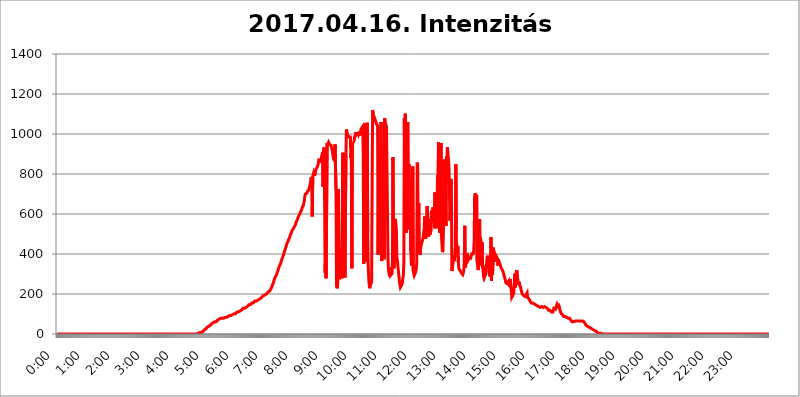
| Category | 2017.04.16. Intenzitás [W/m^2] |
|---|---|
| 0.0 | 0 |
| 0.0006944444444444445 | 0 |
| 0.001388888888888889 | 0 |
| 0.0020833333333333333 | 0 |
| 0.002777777777777778 | 0 |
| 0.003472222222222222 | 0 |
| 0.004166666666666667 | 0 |
| 0.004861111111111111 | 0 |
| 0.005555555555555556 | 0 |
| 0.0062499999999999995 | 0 |
| 0.006944444444444444 | 0 |
| 0.007638888888888889 | 0 |
| 0.008333333333333333 | 0 |
| 0.009027777777777779 | 0 |
| 0.009722222222222222 | 0 |
| 0.010416666666666666 | 0 |
| 0.011111111111111112 | 0 |
| 0.011805555555555555 | 0 |
| 0.012499999999999999 | 0 |
| 0.013194444444444444 | 0 |
| 0.013888888888888888 | 0 |
| 0.014583333333333332 | 0 |
| 0.015277777777777777 | 0 |
| 0.015972222222222224 | 0 |
| 0.016666666666666666 | 0 |
| 0.017361111111111112 | 0 |
| 0.018055555555555557 | 0 |
| 0.01875 | 0 |
| 0.019444444444444445 | 0 |
| 0.02013888888888889 | 0 |
| 0.020833333333333332 | 0 |
| 0.02152777777777778 | 0 |
| 0.022222222222222223 | 0 |
| 0.02291666666666667 | 0 |
| 0.02361111111111111 | 0 |
| 0.024305555555555556 | 0 |
| 0.024999999999999998 | 0 |
| 0.025694444444444447 | 0 |
| 0.02638888888888889 | 0 |
| 0.027083333333333334 | 0 |
| 0.027777777777777776 | 0 |
| 0.02847222222222222 | 0 |
| 0.029166666666666664 | 0 |
| 0.029861111111111113 | 0 |
| 0.030555555555555555 | 0 |
| 0.03125 | 0 |
| 0.03194444444444445 | 0 |
| 0.03263888888888889 | 0 |
| 0.03333333333333333 | 0 |
| 0.034027777777777775 | 0 |
| 0.034722222222222224 | 0 |
| 0.035416666666666666 | 0 |
| 0.036111111111111115 | 0 |
| 0.03680555555555556 | 0 |
| 0.0375 | 0 |
| 0.03819444444444444 | 0 |
| 0.03888888888888889 | 0 |
| 0.03958333333333333 | 0 |
| 0.04027777777777778 | 0 |
| 0.04097222222222222 | 0 |
| 0.041666666666666664 | 0 |
| 0.042361111111111106 | 0 |
| 0.04305555555555556 | 0 |
| 0.043750000000000004 | 0 |
| 0.044444444444444446 | 0 |
| 0.04513888888888889 | 0 |
| 0.04583333333333334 | 0 |
| 0.04652777777777778 | 0 |
| 0.04722222222222222 | 0 |
| 0.04791666666666666 | 0 |
| 0.04861111111111111 | 0 |
| 0.049305555555555554 | 0 |
| 0.049999999999999996 | 0 |
| 0.05069444444444445 | 0 |
| 0.051388888888888894 | 0 |
| 0.052083333333333336 | 0 |
| 0.05277777777777778 | 0 |
| 0.05347222222222222 | 0 |
| 0.05416666666666667 | 0 |
| 0.05486111111111111 | 0 |
| 0.05555555555555555 | 0 |
| 0.05625 | 0 |
| 0.05694444444444444 | 0 |
| 0.057638888888888885 | 0 |
| 0.05833333333333333 | 0 |
| 0.05902777777777778 | 0 |
| 0.059722222222222225 | 0 |
| 0.06041666666666667 | 0 |
| 0.061111111111111116 | 0 |
| 0.06180555555555556 | 0 |
| 0.0625 | 0 |
| 0.06319444444444444 | 0 |
| 0.06388888888888888 | 0 |
| 0.06458333333333334 | 0 |
| 0.06527777777777778 | 0 |
| 0.06597222222222222 | 0 |
| 0.06666666666666667 | 0 |
| 0.06736111111111111 | 0 |
| 0.06805555555555555 | 0 |
| 0.06874999999999999 | 0 |
| 0.06944444444444443 | 0 |
| 0.07013888888888889 | 0 |
| 0.07083333333333333 | 0 |
| 0.07152777777777779 | 0 |
| 0.07222222222222223 | 0 |
| 0.07291666666666667 | 0 |
| 0.07361111111111111 | 0 |
| 0.07430555555555556 | 0 |
| 0.075 | 0 |
| 0.07569444444444444 | 0 |
| 0.0763888888888889 | 0 |
| 0.07708333333333334 | 0 |
| 0.07777777777777778 | 0 |
| 0.07847222222222222 | 0 |
| 0.07916666666666666 | 0 |
| 0.0798611111111111 | 0 |
| 0.08055555555555556 | 0 |
| 0.08125 | 0 |
| 0.08194444444444444 | 0 |
| 0.08263888888888889 | 0 |
| 0.08333333333333333 | 0 |
| 0.08402777777777777 | 0 |
| 0.08472222222222221 | 0 |
| 0.08541666666666665 | 0 |
| 0.08611111111111112 | 0 |
| 0.08680555555555557 | 0 |
| 0.08750000000000001 | 0 |
| 0.08819444444444445 | 0 |
| 0.08888888888888889 | 0 |
| 0.08958333333333333 | 0 |
| 0.09027777777777778 | 0 |
| 0.09097222222222222 | 0 |
| 0.09166666666666667 | 0 |
| 0.09236111111111112 | 0 |
| 0.09305555555555556 | 0 |
| 0.09375 | 0 |
| 0.09444444444444444 | 0 |
| 0.09513888888888888 | 0 |
| 0.09583333333333333 | 0 |
| 0.09652777777777777 | 0 |
| 0.09722222222222222 | 0 |
| 0.09791666666666667 | 0 |
| 0.09861111111111111 | 0 |
| 0.09930555555555555 | 0 |
| 0.09999999999999999 | 0 |
| 0.10069444444444443 | 0 |
| 0.1013888888888889 | 0 |
| 0.10208333333333335 | 0 |
| 0.10277777777777779 | 0 |
| 0.10347222222222223 | 0 |
| 0.10416666666666667 | 0 |
| 0.10486111111111111 | 0 |
| 0.10555555555555556 | 0 |
| 0.10625 | 0 |
| 0.10694444444444444 | 0 |
| 0.1076388888888889 | 0 |
| 0.10833333333333334 | 0 |
| 0.10902777777777778 | 0 |
| 0.10972222222222222 | 0 |
| 0.1111111111111111 | 0 |
| 0.11180555555555556 | 0 |
| 0.11180555555555556 | 0 |
| 0.1125 | 0 |
| 0.11319444444444444 | 0 |
| 0.11388888888888889 | 0 |
| 0.11458333333333333 | 0 |
| 0.11527777777777777 | 0 |
| 0.11597222222222221 | 0 |
| 0.11666666666666665 | 0 |
| 0.1173611111111111 | 0 |
| 0.11805555555555557 | 0 |
| 0.11944444444444445 | 0 |
| 0.12013888888888889 | 0 |
| 0.12083333333333333 | 0 |
| 0.12152777777777778 | 0 |
| 0.12222222222222223 | 0 |
| 0.12291666666666667 | 0 |
| 0.12291666666666667 | 0 |
| 0.12361111111111112 | 0 |
| 0.12430555555555556 | 0 |
| 0.125 | 0 |
| 0.12569444444444444 | 0 |
| 0.12638888888888888 | 0 |
| 0.12708333333333333 | 0 |
| 0.16875 | 0 |
| 0.12847222222222224 | 0 |
| 0.12916666666666668 | 0 |
| 0.12986111111111112 | 0 |
| 0.13055555555555556 | 0 |
| 0.13125 | 0 |
| 0.13194444444444445 | 0 |
| 0.1326388888888889 | 0 |
| 0.13333333333333333 | 0 |
| 0.13402777777777777 | 0 |
| 0.13402777777777777 | 0 |
| 0.13472222222222222 | 0 |
| 0.13541666666666666 | 0 |
| 0.1361111111111111 | 0 |
| 0.13749999999999998 | 0 |
| 0.13819444444444443 | 0 |
| 0.1388888888888889 | 0 |
| 0.13958333333333334 | 0 |
| 0.14027777777777778 | 0 |
| 0.14097222222222222 | 0 |
| 0.14166666666666666 | 0 |
| 0.1423611111111111 | 0 |
| 0.14305555555555557 | 0 |
| 0.14375000000000002 | 0 |
| 0.14444444444444446 | 0 |
| 0.1451388888888889 | 0 |
| 0.1451388888888889 | 0 |
| 0.14652777777777778 | 0 |
| 0.14722222222222223 | 0 |
| 0.14791666666666667 | 0 |
| 0.1486111111111111 | 0 |
| 0.14930555555555555 | 0 |
| 0.15 | 0 |
| 0.15069444444444444 | 0 |
| 0.15138888888888888 | 0 |
| 0.15208333333333332 | 0 |
| 0.15277777777777776 | 0 |
| 0.15347222222222223 | 0 |
| 0.15416666666666667 | 0 |
| 0.15486111111111112 | 0 |
| 0.15555555555555556 | 0 |
| 0.15625 | 0 |
| 0.15694444444444444 | 0 |
| 0.15763888888888888 | 0 |
| 0.15833333333333333 | 0 |
| 0.15902777777777777 | 0 |
| 0.15972222222222224 | 0 |
| 0.16041666666666668 | 0 |
| 0.16111111111111112 | 0 |
| 0.16180555555555556 | 0 |
| 0.1625 | 0 |
| 0.16319444444444445 | 0 |
| 0.1638888888888889 | 0 |
| 0.16458333333333333 | 0 |
| 0.16527777777777777 | 0 |
| 0.16597222222222222 | 0 |
| 0.16666666666666666 | 0 |
| 0.1673611111111111 | 0 |
| 0.16805555555555554 | 0 |
| 0.16874999999999998 | 0 |
| 0.16944444444444443 | 0 |
| 0.17013888888888887 | 0 |
| 0.1708333333333333 | 0 |
| 0.17152777777777775 | 0 |
| 0.17222222222222225 | 0 |
| 0.1729166666666667 | 0 |
| 0.17361111111111113 | 0 |
| 0.17430555555555557 | 0 |
| 0.17500000000000002 | 0 |
| 0.17569444444444446 | 0 |
| 0.1763888888888889 | 0 |
| 0.17708333333333334 | 0 |
| 0.17777777777777778 | 0 |
| 0.17847222222222223 | 0 |
| 0.17916666666666667 | 0 |
| 0.1798611111111111 | 0 |
| 0.18055555555555555 | 0 |
| 0.18125 | 0 |
| 0.18194444444444444 | 0 |
| 0.1826388888888889 | 0 |
| 0.18333333333333335 | 0 |
| 0.1840277777777778 | 0 |
| 0.18472222222222223 | 0 |
| 0.18541666666666667 | 0 |
| 0.18611111111111112 | 0 |
| 0.18680555555555556 | 0 |
| 0.1875 | 0 |
| 0.18819444444444444 | 0 |
| 0.18888888888888888 | 0 |
| 0.18958333333333333 | 0 |
| 0.19027777777777777 | 0 |
| 0.1909722222222222 | 0 |
| 0.19166666666666665 | 0 |
| 0.19236111111111112 | 0 |
| 0.19305555555555554 | 0 |
| 0.19375 | 0 |
| 0.19444444444444445 | 0 |
| 0.1951388888888889 | 3.525 |
| 0.19583333333333333 | 0 |
| 0.19652777777777777 | 3.525 |
| 0.19722222222222222 | 3.525 |
| 0.19791666666666666 | 3.525 |
| 0.1986111111111111 | 3.525 |
| 0.19930555555555554 | 3.525 |
| 0.19999999999999998 | 7.887 |
| 0.20069444444444443 | 7.887 |
| 0.20138888888888887 | 7.887 |
| 0.2020833333333333 | 7.887 |
| 0.2027777777777778 | 12.257 |
| 0.2034722222222222 | 12.257 |
| 0.2041666666666667 | 12.257 |
| 0.20486111111111113 | 12.257 |
| 0.20555555555555557 | 16.636 |
| 0.20625000000000002 | 21.024 |
| 0.20694444444444446 | 21.024 |
| 0.2076388888888889 | 25.419 |
| 0.20833333333333334 | 25.419 |
| 0.20902777777777778 | 29.823 |
| 0.20972222222222223 | 29.823 |
| 0.21041666666666667 | 34.234 |
| 0.2111111111111111 | 34.234 |
| 0.21180555555555555 | 38.653 |
| 0.2125 | 38.653 |
| 0.21319444444444444 | 38.653 |
| 0.2138888888888889 | 43.079 |
| 0.21458333333333335 | 43.079 |
| 0.2152777777777778 | 47.511 |
| 0.21597222222222223 | 47.511 |
| 0.21666666666666667 | 51.951 |
| 0.21736111111111112 | 51.951 |
| 0.21805555555555556 | 56.398 |
| 0.21875 | 56.398 |
| 0.21944444444444444 | 56.398 |
| 0.22013888888888888 | 60.85 |
| 0.22083333333333333 | 60.85 |
| 0.22152777777777777 | 60.85 |
| 0.2222222222222222 | 60.85 |
| 0.22291666666666665 | 60.85 |
| 0.2236111111111111 | 65.31 |
| 0.22430555555555556 | 65.31 |
| 0.225 | 69.775 |
| 0.22569444444444445 | 69.775 |
| 0.2263888888888889 | 74.246 |
| 0.22708333333333333 | 74.246 |
| 0.22777777777777777 | 74.246 |
| 0.22847222222222222 | 78.722 |
| 0.22916666666666666 | 78.722 |
| 0.2298611111111111 | 78.722 |
| 0.23055555555555554 | 78.722 |
| 0.23124999999999998 | 78.722 |
| 0.23194444444444443 | 78.722 |
| 0.23263888888888887 | 78.722 |
| 0.2333333333333333 | 78.722 |
| 0.2340277777777778 | 83.205 |
| 0.2347222222222222 | 83.205 |
| 0.2354166666666667 | 83.205 |
| 0.23611111111111113 | 83.205 |
| 0.23680555555555557 | 83.205 |
| 0.23750000000000002 | 83.205 |
| 0.23819444444444446 | 83.205 |
| 0.2388888888888889 | 87.692 |
| 0.23958333333333334 | 87.692 |
| 0.24027777777777778 | 87.692 |
| 0.24097222222222223 | 87.692 |
| 0.24166666666666667 | 92.184 |
| 0.2423611111111111 | 92.184 |
| 0.24305555555555555 | 92.184 |
| 0.24375 | 92.184 |
| 0.24444444444444446 | 92.184 |
| 0.24513888888888888 | 96.682 |
| 0.24583333333333335 | 96.682 |
| 0.2465277777777778 | 96.682 |
| 0.24722222222222223 | 101.184 |
| 0.24791666666666667 | 101.184 |
| 0.24861111111111112 | 101.184 |
| 0.24930555555555556 | 101.184 |
| 0.25 | 101.184 |
| 0.25069444444444444 | 105.69 |
| 0.2513888888888889 | 105.69 |
| 0.2520833333333333 | 110.201 |
| 0.25277777777777777 | 110.201 |
| 0.2534722222222222 | 110.201 |
| 0.25416666666666665 | 110.201 |
| 0.2548611111111111 | 114.716 |
| 0.2555555555555556 | 114.716 |
| 0.25625000000000003 | 114.716 |
| 0.2569444444444445 | 119.235 |
| 0.2576388888888889 | 119.235 |
| 0.25833333333333336 | 119.235 |
| 0.2590277777777778 | 123.758 |
| 0.25972222222222224 | 123.758 |
| 0.2604166666666667 | 128.284 |
| 0.2611111111111111 | 128.284 |
| 0.26180555555555557 | 128.284 |
| 0.2625 | 128.284 |
| 0.26319444444444445 | 132.814 |
| 0.2638888888888889 | 132.814 |
| 0.26458333333333334 | 132.814 |
| 0.2652777777777778 | 137.347 |
| 0.2659722222222222 | 137.347 |
| 0.26666666666666666 | 137.347 |
| 0.2673611111111111 | 141.884 |
| 0.26805555555555555 | 141.884 |
| 0.26875 | 146.423 |
| 0.26944444444444443 | 146.423 |
| 0.2701388888888889 | 146.423 |
| 0.2708333333333333 | 146.423 |
| 0.27152777777777776 | 150.964 |
| 0.2722222222222222 | 150.964 |
| 0.27291666666666664 | 155.509 |
| 0.2736111111111111 | 155.509 |
| 0.2743055555555555 | 155.509 |
| 0.27499999999999997 | 155.509 |
| 0.27569444444444446 | 160.056 |
| 0.27638888888888885 | 160.056 |
| 0.27708333333333335 | 164.605 |
| 0.2777777777777778 | 164.605 |
| 0.27847222222222223 | 164.605 |
| 0.2791666666666667 | 164.605 |
| 0.2798611111111111 | 169.156 |
| 0.28055555555555556 | 169.156 |
| 0.28125 | 169.156 |
| 0.28194444444444444 | 173.709 |
| 0.2826388888888889 | 173.709 |
| 0.2833333333333333 | 173.709 |
| 0.28402777777777777 | 178.264 |
| 0.2847222222222222 | 178.264 |
| 0.28541666666666665 | 178.264 |
| 0.28611111111111115 | 182.82 |
| 0.28680555555555554 | 182.82 |
| 0.28750000000000003 | 187.378 |
| 0.2881944444444445 | 187.378 |
| 0.2888888888888889 | 187.378 |
| 0.28958333333333336 | 191.937 |
| 0.2902777777777778 | 191.937 |
| 0.29097222222222224 | 191.937 |
| 0.2916666666666667 | 196.497 |
| 0.2923611111111111 | 196.497 |
| 0.29305555555555557 | 201.058 |
| 0.29375 | 201.058 |
| 0.29444444444444445 | 205.62 |
| 0.2951388888888889 | 205.62 |
| 0.29583333333333334 | 210.182 |
| 0.2965277777777778 | 210.182 |
| 0.2972222222222222 | 210.182 |
| 0.29791666666666666 | 214.746 |
| 0.2986111111111111 | 219.309 |
| 0.29930555555555555 | 223.873 |
| 0.3 | 228.436 |
| 0.30069444444444443 | 233 |
| 0.3013888888888889 | 237.564 |
| 0.3020833333333333 | 246.689 |
| 0.30277777777777776 | 251.251 |
| 0.3034722222222222 | 260.373 |
| 0.30416666666666664 | 269.49 |
| 0.3048611111111111 | 278.603 |
| 0.3055555555555555 | 283.156 |
| 0.30624999999999997 | 287.709 |
| 0.3069444444444444 | 292.259 |
| 0.3076388888888889 | 296.808 |
| 0.30833333333333335 | 305.898 |
| 0.3090277777777778 | 310.44 |
| 0.30972222222222223 | 319.517 |
| 0.3104166666666667 | 328.584 |
| 0.3111111111111111 | 333.113 |
| 0.31180555555555556 | 342.162 |
| 0.3125 | 346.682 |
| 0.31319444444444444 | 351.198 |
| 0.3138888888888889 | 360.221 |
| 0.3145833333333333 | 369.23 |
| 0.31527777777777777 | 373.729 |
| 0.3159722222222222 | 382.715 |
| 0.31666666666666665 | 387.202 |
| 0.31736111111111115 | 396.164 |
| 0.31805555555555554 | 405.108 |
| 0.31875000000000003 | 414.035 |
| 0.3194444444444445 | 418.492 |
| 0.3201388888888889 | 427.39 |
| 0.32083333333333336 | 436.27 |
| 0.3215277777777778 | 445.129 |
| 0.32222222222222224 | 453.968 |
| 0.3229166666666667 | 458.38 |
| 0.3236111111111111 | 462.786 |
| 0.32430555555555557 | 471.582 |
| 0.325 | 475.972 |
| 0.32569444444444445 | 480.356 |
| 0.3263888888888889 | 489.108 |
| 0.32708333333333334 | 497.836 |
| 0.3277777777777778 | 502.192 |
| 0.3284722222222222 | 506.542 |
| 0.32916666666666666 | 515.223 |
| 0.3298611111111111 | 515.223 |
| 0.33055555555555555 | 523.88 |
| 0.33125 | 528.2 |
| 0.33194444444444443 | 532.513 |
| 0.3326388888888889 | 536.82 |
| 0.3333333333333333 | 541.121 |
| 0.3340277777777778 | 545.416 |
| 0.3347222222222222 | 553.986 |
| 0.3354166666666667 | 558.261 |
| 0.3361111111111111 | 566.793 |
| 0.3368055555555556 | 571.049 |
| 0.33749999999999997 | 579.542 |
| 0.33819444444444446 | 583.779 |
| 0.33888888888888885 | 592.233 |
| 0.33958333333333335 | 596.45 |
| 0.34027777777777773 | 600.661 |
| 0.34097222222222223 | 609.062 |
| 0.3416666666666666 | 613.252 |
| 0.3423611111111111 | 617.436 |
| 0.3430555555555555 | 625.784 |
| 0.34375 | 634.105 |
| 0.3444444444444445 | 638.256 |
| 0.3451388888888889 | 642.4 |
| 0.3458333333333334 | 654.791 |
| 0.34652777777777777 | 667.123 |
| 0.34722222222222227 | 687.544 |
| 0.34791666666666665 | 699.717 |
| 0.34861111111111115 | 703.762 |
| 0.34930555555555554 | 703.762 |
| 0.35000000000000003 | 703.762 |
| 0.3506944444444444 | 711.832 |
| 0.3513888888888889 | 715.858 |
| 0.3520833333333333 | 715.858 |
| 0.3527777777777778 | 719.877 |
| 0.3534722222222222 | 731.896 |
| 0.3541666666666667 | 739.877 |
| 0.3548611111111111 | 751.803 |
| 0.35555555555555557 | 767.62 |
| 0.35625 | 783.342 |
| 0.35694444444444445 | 751.803 |
| 0.3576388888888889 | 588.009 |
| 0.35833333333333334 | 787.258 |
| 0.3590277777777778 | 787.258 |
| 0.3597222222222222 | 806.757 |
| 0.36041666666666666 | 798.974 |
| 0.3611111111111111 | 791.169 |
| 0.36180555555555555 | 806.757 |
| 0.3625 | 818.392 |
| 0.36319444444444443 | 826.123 |
| 0.3638888888888889 | 829.981 |
| 0.3645833333333333 | 833.834 |
| 0.3652777777777778 | 841.526 |
| 0.3659722222222222 | 849.199 |
| 0.3666666666666667 | 868.305 |
| 0.3673611111111111 | 872.114 |
| 0.3680555555555556 | 868.305 |
| 0.36874999999999997 | 864.493 |
| 0.36944444444444446 | 868.305 |
| 0.37013888888888885 | 879.719 |
| 0.37083333333333335 | 887.309 |
| 0.37152777777777773 | 883.516 |
| 0.37222222222222223 | 909.996 |
| 0.3729166666666666 | 735.89 |
| 0.3736111111111111 | 925.06 |
| 0.3743055555555555 | 932.576 |
| 0.375 | 667.123 |
| 0.3756944444444445 | 305.898 |
| 0.3763888888888889 | 391.685 |
| 0.3770833333333334 | 278.603 |
| 0.37777777777777777 | 283.156 |
| 0.37847222222222227 | 955.071 |
| 0.37916666666666665 | 947.58 |
| 0.37986111111111115 | 947.58 |
| 0.38055555555555554 | 958.814 |
| 0.38125000000000003 | 955.071 |
| 0.3819444444444444 | 947.58 |
| 0.3826388888888889 | 943.832 |
| 0.3833333333333333 | 943.832 |
| 0.3840277777777778 | 943.832 |
| 0.3847222222222222 | 932.576 |
| 0.3854166666666667 | 921.298 |
| 0.3861111111111111 | 921.298 |
| 0.38680555555555557 | 921.298 |
| 0.3875 | 875.918 |
| 0.38819444444444445 | 872.114 |
| 0.3888888888888889 | 864.493 |
| 0.38958333333333334 | 947.58 |
| 0.3902777777777778 | 943.832 |
| 0.3909722222222222 | 719.877 |
| 0.39166666666666666 | 242.127 |
| 0.3923611111111111 | 228.436 |
| 0.39305555555555555 | 237.564 |
| 0.39375 | 278.603 |
| 0.39444444444444443 | 723.889 |
| 0.3951388888888889 | 310.44 |
| 0.3958333333333333 | 274.047 |
| 0.3965277777777778 | 274.047 |
| 0.3972222222222222 | 287.709 |
| 0.3979166666666667 | 427.39 |
| 0.3986111111111111 | 324.052 |
| 0.3993055555555556 | 278.603 |
| 0.39999999999999997 | 283.156 |
| 0.40069444444444446 | 906.223 |
| 0.40138888888888885 | 328.584 |
| 0.40208333333333335 | 414.035 |
| 0.40277777777777773 | 558.261 |
| 0.40347222222222223 | 283.156 |
| 0.4041666666666666 | 283.156 |
| 0.4048611111111111 | 898.668 |
| 0.4055555555555555 | 1022.323 |
| 0.40625 | 1011.118 |
| 0.4069444444444445 | 999.916 |
| 0.4076388888888889 | 992.448 |
| 0.4083333333333334 | 988.714 |
| 0.40902777777777777 | 984.98 |
| 0.40972222222222227 | 981.244 |
| 0.41041666666666665 | 981.244 |
| 0.41111111111111115 | 984.98 |
| 0.41180555555555554 | 879.719 |
| 0.41250000000000003 | 902.447 |
| 0.4131944444444444 | 328.584 |
| 0.4138888888888889 | 940.082 |
| 0.4145833333333333 | 955.071 |
| 0.4152777777777778 | 955.071 |
| 0.4159722222222222 | 962.555 |
| 0.4166666666666667 | 970.034 |
| 0.4173611111111111 | 992.448 |
| 0.41805555555555557 | 984.98 |
| 0.41875 | 1007.383 |
| 0.41944444444444445 | 992.448 |
| 0.4201388888888889 | 1007.383 |
| 0.42083333333333334 | 992.448 |
| 0.4215277777777778 | 1007.383 |
| 0.4222222222222222 | 999.916 |
| 0.42291666666666666 | 1011.118 |
| 0.4236111111111111 | 1007.383 |
| 0.42430555555555555 | 992.448 |
| 0.425 | 1014.852 |
| 0.42569444444444443 | 1007.383 |
| 0.4263888888888889 | 1026.06 |
| 0.4270833333333333 | 1026.06 |
| 0.4277777777777778 | 1022.323 |
| 0.4284722222222222 | 1037.277 |
| 0.4291666666666667 | 902.447 |
| 0.4298611111111111 | 351.198 |
| 0.4305555555555556 | 1037.277 |
| 0.43124999999999997 | 1052.255 |
| 0.43194444444444446 | 1037.277 |
| 0.43263888888888885 | 1029.798 |
| 0.43333333333333335 | 360.221 |
| 0.43402777777777773 | 588.009 |
| 0.43472222222222223 | 1056.004 |
| 0.4354166666666666 | 506.542 |
| 0.4361111111111111 | 337.639 |
| 0.4368055555555555 | 283.156 |
| 0.4375 | 246.689 |
| 0.4381944444444445 | 228.436 |
| 0.4388888888888889 | 242.127 |
| 0.4395833333333334 | 237.564 |
| 0.44027777777777777 | 242.127 |
| 0.44097222222222227 | 260.373 |
| 0.44166666666666665 | 747.834 |
| 0.44236111111111115 | 1120.238 |
| 0.44305555555555554 | 1101.226 |
| 0.44375000000000003 | 1093.653 |
| 0.4444444444444444 | 1086.097 |
| 0.4451388888888889 | 1082.324 |
| 0.4458333333333333 | 1071.027 |
| 0.4465277777777778 | 1063.51 |
| 0.4472222222222222 | 1056.004 |
| 0.4479166666666667 | 1048.508 |
| 0.4486111111111111 | 1044.762 |
| 0.44930555555555557 | 1041.019 |
| 0.45 | 396.164 |
| 0.45069444444444445 | 810.641 |
| 0.4513888888888889 | 868.305 |
| 0.45208333333333334 | 822.26 |
| 0.4527777777777778 | 588.009 |
| 0.4534722222222222 | 879.719 |
| 0.45416666666666666 | 1059.756 |
| 0.4548611111111111 | 364.728 |
| 0.45555555555555555 | 378.224 |
| 0.45625 | 387.202 |
| 0.45694444444444443 | 422.943 |
| 0.4576388888888889 | 951.327 |
| 0.4583333333333333 | 373.729 |
| 0.4590277777777778 | 1078.555 |
| 0.4597222222222222 | 1071.027 |
| 0.4604166666666667 | 1056.004 |
| 0.4611111111111111 | 1044.762 |
| 0.4618055555555556 | 1033.537 |
| 0.46249999999999997 | 1037.277 |
| 0.46319444444444446 | 1033.537 |
| 0.46388888888888885 | 369.23 |
| 0.46458333333333335 | 319.517 |
| 0.46527777777777773 | 305.898 |
| 0.46597222222222223 | 305.898 |
| 0.4666666666666666 | 314.98 |
| 0.4673611111111111 | 292.259 |
| 0.4680555555555555 | 287.709 |
| 0.46875 | 296.808 |
| 0.4694444444444445 | 301.354 |
| 0.4701388888888889 | 355.712 |
| 0.4708333333333334 | 883.516 |
| 0.47152777777777777 | 342.162 |
| 0.47222222222222227 | 328.584 |
| 0.47291666666666665 | 346.682 |
| 0.47361111111111115 | 549.704 |
| 0.47430555555555554 | 575.299 |
| 0.47500000000000003 | 579.542 |
| 0.4756944444444444 | 493.475 |
| 0.4763888888888889 | 382.715 |
| 0.4770833333333333 | 369.23 |
| 0.4777777777777778 | 337.639 |
| 0.4784722222222222 | 333.113 |
| 0.4791666666666667 | 292.259 |
| 0.4798611111111111 | 264.932 |
| 0.48055555555555557 | 246.689 |
| 0.48125 | 233 |
| 0.48194444444444445 | 233 |
| 0.4826388888888889 | 242.127 |
| 0.48333333333333334 | 246.689 |
| 0.4840277777777778 | 255.813 |
| 0.4847222222222222 | 278.603 |
| 0.48541666666666666 | 292.259 |
| 0.4861111111111111 | 355.712 |
| 0.48680555555555555 | 1078.555 |
| 0.4875 | 747.834 |
| 0.48819444444444443 | 1101.226 |
| 0.4888888888888889 | 691.608 |
| 0.4895833333333333 | 506.542 |
| 0.4902777777777778 | 625.784 |
| 0.4909722222222222 | 1033.537 |
| 0.4916666666666667 | 1059.756 |
| 0.4923611111111111 | 523.88 |
| 0.4930555555555556 | 849.199 |
| 0.49374999999999997 | 837.682 |
| 0.49444444444444446 | 549.704 |
| 0.49513888888888885 | 771.559 |
| 0.49583333333333335 | 414.035 |
| 0.49652777777777773 | 355.712 |
| 0.49722222222222223 | 342.162 |
| 0.4979166666666666 | 373.729 |
| 0.4986111111111111 | 837.682 |
| 0.4993055555555555 | 314.98 |
| 0.5 | 301.354 |
| 0.5006944444444444 | 292.259 |
| 0.5013888888888889 | 292.259 |
| 0.5020833333333333 | 296.808 |
| 0.5027777777777778 | 310.44 |
| 0.5034722222222222 | 324.052 |
| 0.5041666666666667 | 355.712 |
| 0.5048611111111111 | 856.855 |
| 0.5055555555555555 | 833.834 |
| 0.50625 | 409.574 |
| 0.5069444444444444 | 654.791 |
| 0.5076388888888889 | 405.108 |
| 0.5083333333333333 | 414.035 |
| 0.5090277777777777 | 396.164 |
| 0.5097222222222222 | 431.833 |
| 0.5104166666666666 | 445.129 |
| 0.5111111111111112 | 449.551 |
| 0.5118055555555555 | 449.551 |
| 0.5125000000000001 | 471.582 |
| 0.5131944444444444 | 484.735 |
| 0.513888888888889 | 480.356 |
| 0.5145833333333333 | 523.88 |
| 0.5152777777777778 | 588.009 |
| 0.5159722222222222 | 506.542 |
| 0.5166666666666667 | 475.972 |
| 0.517361111111111 | 502.192 |
| 0.5180555555555556 | 484.735 |
| 0.5187499999999999 | 638.256 |
| 0.5194444444444445 | 609.062 |
| 0.5201388888888888 | 609.062 |
| 0.5208333333333334 | 484.735 |
| 0.5215277777777778 | 575.299 |
| 0.5222222222222223 | 532.513 |
| 0.5229166666666667 | 497.836 |
| 0.5236111111111111 | 497.836 |
| 0.5243055555555556 | 523.88 |
| 0.525 | 617.436 |
| 0.5256944444444445 | 592.233 |
| 0.5263888888888889 | 558.261 |
| 0.5270833333333333 | 634.105 |
| 0.5277777777777778 | 625.784 |
| 0.5284722222222222 | 566.793 |
| 0.5291666666666667 | 528.2 |
| 0.5298611111111111 | 707.8 |
| 0.5305555555555556 | 541.121 |
| 0.53125 | 625.784 |
| 0.5319444444444444 | 596.45 |
| 0.5326388888888889 | 528.2 |
| 0.5333333333333333 | 795.074 |
| 0.5340277777777778 | 679.395 |
| 0.5347222222222222 | 958.814 |
| 0.5354166666666667 | 891.099 |
| 0.5361111111111111 | 506.542 |
| 0.5368055555555555 | 913.766 |
| 0.5375 | 849.199 |
| 0.5381944444444444 | 955.071 |
| 0.5388888888888889 | 484.735 |
| 0.5395833333333333 | 449.551 |
| 0.5402777777777777 | 409.574 |
| 0.5409722222222222 | 418.492 |
| 0.5416666666666666 | 523.88 |
| 0.5423611111111112 | 872.114 |
| 0.5430555555555555 | 549.704 |
| 0.5437500000000001 | 579.542 |
| 0.5444444444444444 | 650.667 |
| 0.545138888888889 | 541.121 |
| 0.5458333333333333 | 887.309 |
| 0.5465277777777778 | 759.723 |
| 0.5472222222222222 | 932.576 |
| 0.5479166666666667 | 894.885 |
| 0.548611111111111 | 879.719 |
| 0.5493055555555556 | 845.365 |
| 0.5499999999999999 | 739.877 |
| 0.5506944444444445 | 566.793 |
| 0.5513888888888888 | 604.864 |
| 0.5520833333333334 | 775.492 |
| 0.5527777777777778 | 755.766 |
| 0.5534722222222223 | 314.98 |
| 0.5541666666666667 | 328.584 |
| 0.5548611111111111 | 328.584 |
| 0.5555555555555556 | 369.23 |
| 0.55625 | 391.685 |
| 0.5569444444444445 | 364.728 |
| 0.5576388888888889 | 391.685 |
| 0.5583333333333333 | 431.833 |
| 0.5590277777777778 | 849.199 |
| 0.5597222222222222 | 506.542 |
| 0.5604166666666667 | 387.202 |
| 0.5611111111111111 | 391.685 |
| 0.5618055555555556 | 440.702 |
| 0.5625 | 360.221 |
| 0.5631944444444444 | 328.584 |
| 0.5638888888888889 | 324.052 |
| 0.5645833333333333 | 324.052 |
| 0.5652777777777778 | 314.98 |
| 0.5659722222222222 | 310.44 |
| 0.5666666666666667 | 305.898 |
| 0.5673611111111111 | 305.898 |
| 0.5680555555555555 | 305.898 |
| 0.56875 | 296.808 |
| 0.5694444444444444 | 296.808 |
| 0.5701388888888889 | 314.98 |
| 0.5708333333333333 | 360.221 |
| 0.5715277777777777 | 541.121 |
| 0.5722222222222222 | 333.113 |
| 0.5729166666666666 | 342.162 |
| 0.5736111111111112 | 373.729 |
| 0.5743055555555555 | 364.728 |
| 0.5750000000000001 | 405.108 |
| 0.5756944444444444 | 391.685 |
| 0.576388888888889 | 369.23 |
| 0.5770833333333333 | 369.23 |
| 0.5777777777777778 | 378.224 |
| 0.5784722222222222 | 382.715 |
| 0.5791666666666667 | 378.224 |
| 0.579861111111111 | 378.224 |
| 0.5805555555555556 | 382.715 |
| 0.5812499999999999 | 400.638 |
| 0.5819444444444445 | 405.108 |
| 0.5826388888888888 | 400.638 |
| 0.5833333333333334 | 400.638 |
| 0.5840277777777778 | 414.035 |
| 0.5847222222222223 | 458.38 |
| 0.5854166666666667 | 691.608 |
| 0.5861111111111111 | 703.762 |
| 0.5868055555555556 | 695.666 |
| 0.5875 | 683.473 |
| 0.5881944444444445 | 695.666 |
| 0.5888888888888889 | 364.728 |
| 0.5895833333333333 | 342.162 |
| 0.5902777777777778 | 319.517 |
| 0.5909722222222222 | 324.052 |
| 0.5916666666666667 | 369.23 |
| 0.5923611111111111 | 575.299 |
| 0.5930555555555556 | 342.162 |
| 0.59375 | 484.735 |
| 0.5944444444444444 | 360.221 |
| 0.5951388888888889 | 351.198 |
| 0.5958333333333333 | 458.38 |
| 0.5965277777777778 | 328.584 |
| 0.5972222222222222 | 342.162 |
| 0.5979166666666667 | 287.709 |
| 0.5986111111111111 | 278.603 |
| 0.5993055555555555 | 278.603 |
| 0.6 | 292.259 |
| 0.6006944444444444 | 292.259 |
| 0.6013888888888889 | 301.354 |
| 0.6020833333333333 | 305.898 |
| 0.6027777777777777 | 382.715 |
| 0.6034722222222222 | 391.685 |
| 0.6041666666666666 | 337.639 |
| 0.6048611111111112 | 351.198 |
| 0.6055555555555555 | 333.113 |
| 0.6062500000000001 | 301.354 |
| 0.6069444444444444 | 287.709 |
| 0.607638888888889 | 346.682 |
| 0.6083333333333333 | 484.735 |
| 0.6090277777777778 | 264.932 |
| 0.6097222222222222 | 360.221 |
| 0.6104166666666667 | 296.808 |
| 0.611111111111111 | 355.712 |
| 0.6118055555555556 | 431.833 |
| 0.6124999999999999 | 400.638 |
| 0.6131944444444445 | 360.221 |
| 0.6138888888888888 | 382.715 |
| 0.6145833333333334 | 396.164 |
| 0.6152777777777778 | 391.685 |
| 0.6159722222222223 | 387.202 |
| 0.6166666666666667 | 382.715 |
| 0.6173611111111111 | 378.224 |
| 0.6180555555555556 | 342.162 |
| 0.61875 | 373.729 |
| 0.6194444444444445 | 360.221 |
| 0.6201388888888889 | 360.221 |
| 0.6208333333333333 | 351.198 |
| 0.6215277777777778 | 346.682 |
| 0.6222222222222222 | 333.113 |
| 0.6229166666666667 | 328.584 |
| 0.6236111111111111 | 324.052 |
| 0.6243055555555556 | 319.517 |
| 0.625 | 314.98 |
| 0.6256944444444444 | 310.44 |
| 0.6263888888888889 | 296.808 |
| 0.6270833333333333 | 287.709 |
| 0.6277777777777778 | 287.709 |
| 0.6284722222222222 | 269.49 |
| 0.6291666666666667 | 255.813 |
| 0.6298611111111111 | 251.251 |
| 0.6305555555555555 | 251.251 |
| 0.63125 | 251.251 |
| 0.6319444444444444 | 255.813 |
| 0.6326388888888889 | 255.813 |
| 0.6333333333333333 | 264.932 |
| 0.6340277777777777 | 264.932 |
| 0.6347222222222222 | 237.564 |
| 0.6354166666666666 | 274.047 |
| 0.6361111111111112 | 233 |
| 0.6368055555555555 | 219.309 |
| 0.6375000000000001 | 182.82 |
| 0.6381944444444444 | 187.378 |
| 0.638888888888889 | 191.937 |
| 0.6395833333333333 | 191.937 |
| 0.6402777777777778 | 205.62 |
| 0.6409722222222222 | 251.251 |
| 0.6416666666666667 | 301.354 |
| 0.642361111111111 | 233 |
| 0.6430555555555556 | 251.251 |
| 0.6437499999999999 | 305.898 |
| 0.6444444444444445 | 319.517 |
| 0.6451388888888888 | 324.052 |
| 0.6458333333333334 | 319.517 |
| 0.6465277777777778 | 246.689 |
| 0.6472222222222223 | 246.689 |
| 0.6479166666666667 | 260.373 |
| 0.6486111111111111 | 242.127 |
| 0.6493055555555556 | 237.564 |
| 0.65 | 233 |
| 0.6506944444444445 | 219.309 |
| 0.6513888888888889 | 210.182 |
| 0.6520833333333333 | 201.058 |
| 0.6527777777777778 | 196.497 |
| 0.6534722222222222 | 196.497 |
| 0.6541666666666667 | 191.937 |
| 0.6548611111111111 | 191.937 |
| 0.6555555555555556 | 191.937 |
| 0.65625 | 187.378 |
| 0.6569444444444444 | 191.937 |
| 0.6576388888888889 | 196.497 |
| 0.6583333333333333 | 191.937 |
| 0.6590277777777778 | 205.62 |
| 0.6597222222222222 | 182.82 |
| 0.6604166666666667 | 182.82 |
| 0.6611111111111111 | 178.264 |
| 0.6618055555555555 | 173.709 |
| 0.6625 | 169.156 |
| 0.6631944444444444 | 164.605 |
| 0.6638888888888889 | 160.056 |
| 0.6645833333333333 | 155.509 |
| 0.6652777777777777 | 155.509 |
| 0.6659722222222222 | 155.509 |
| 0.6666666666666666 | 155.509 |
| 0.6673611111111111 | 150.964 |
| 0.6680555555555556 | 150.964 |
| 0.6687500000000001 | 150.964 |
| 0.6694444444444444 | 146.423 |
| 0.6701388888888888 | 146.423 |
| 0.6708333333333334 | 146.423 |
| 0.6715277777777778 | 146.423 |
| 0.6722222222222222 | 141.884 |
| 0.6729166666666666 | 141.884 |
| 0.6736111111111112 | 137.347 |
| 0.6743055555555556 | 137.347 |
| 0.6749999999999999 | 137.347 |
| 0.6756944444444444 | 137.347 |
| 0.6763888888888889 | 132.814 |
| 0.6770833333333334 | 132.814 |
| 0.6777777777777777 | 132.814 |
| 0.6784722222222223 | 132.814 |
| 0.6791666666666667 | 137.347 |
| 0.6798611111111111 | 132.814 |
| 0.6805555555555555 | 132.814 |
| 0.68125 | 132.814 |
| 0.6819444444444445 | 132.814 |
| 0.6826388888888889 | 137.347 |
| 0.6833333333333332 | 137.347 |
| 0.6840277777777778 | 137.347 |
| 0.6847222222222222 | 132.814 |
| 0.6854166666666667 | 132.814 |
| 0.686111111111111 | 132.814 |
| 0.6868055555555556 | 128.284 |
| 0.6875 | 128.284 |
| 0.6881944444444444 | 123.758 |
| 0.688888888888889 | 119.235 |
| 0.6895833333333333 | 119.235 |
| 0.6902777777777778 | 119.235 |
| 0.6909722222222222 | 119.235 |
| 0.6916666666666668 | 114.716 |
| 0.6923611111111111 | 114.716 |
| 0.6930555555555555 | 110.201 |
| 0.69375 | 110.201 |
| 0.6944444444444445 | 110.201 |
| 0.6951388888888889 | 110.201 |
| 0.6958333333333333 | 119.235 |
| 0.6965277777777777 | 128.284 |
| 0.6972222222222223 | 128.284 |
| 0.6979166666666666 | 123.758 |
| 0.6986111111111111 | 123.758 |
| 0.6993055555555556 | 132.814 |
| 0.7000000000000001 | 128.284 |
| 0.7006944444444444 | 146.423 |
| 0.7013888888888888 | 146.423 |
| 0.7020833333333334 | 128.284 |
| 0.7027777777777778 | 150.964 |
| 0.7034722222222222 | 150.964 |
| 0.7041666666666666 | 132.814 |
| 0.7048611111111112 | 123.758 |
| 0.7055555555555556 | 114.716 |
| 0.7062499999999999 | 105.69 |
| 0.7069444444444444 | 101.184 |
| 0.7076388888888889 | 101.184 |
| 0.7083333333333334 | 96.682 |
| 0.7090277777777777 | 96.682 |
| 0.7097222222222223 | 92.184 |
| 0.7104166666666667 | 87.692 |
| 0.7111111111111111 | 83.205 |
| 0.7118055555555555 | 83.205 |
| 0.7125 | 87.692 |
| 0.7131944444444445 | 83.205 |
| 0.7138888888888889 | 87.692 |
| 0.7145833333333332 | 83.205 |
| 0.7152777777777778 | 83.205 |
| 0.7159722222222222 | 83.205 |
| 0.7166666666666667 | 78.722 |
| 0.717361111111111 | 78.722 |
| 0.7180555555555556 | 78.722 |
| 0.71875 | 78.722 |
| 0.7194444444444444 | 78.722 |
| 0.720138888888889 | 69.775 |
| 0.7208333333333333 | 69.775 |
| 0.7215277777777778 | 69.775 |
| 0.7222222222222222 | 60.85 |
| 0.7229166666666668 | 60.85 |
| 0.7236111111111111 | 60.85 |
| 0.7243055555555555 | 60.85 |
| 0.725 | 60.85 |
| 0.7256944444444445 | 56.398 |
| 0.7263888888888889 | 65.31 |
| 0.7270833333333333 | 65.31 |
| 0.7277777777777777 | 65.31 |
| 0.7284722222222223 | 65.31 |
| 0.7291666666666666 | 65.31 |
| 0.7298611111111111 | 65.31 |
| 0.7305555555555556 | 65.31 |
| 0.7312500000000001 | 65.31 |
| 0.7319444444444444 | 65.31 |
| 0.7326388888888888 | 65.31 |
| 0.7333333333333334 | 65.31 |
| 0.7340277777777778 | 65.31 |
| 0.7347222222222222 | 65.31 |
| 0.7354166666666666 | 65.31 |
| 0.7361111111111112 | 65.31 |
| 0.7368055555555556 | 65.31 |
| 0.7374999999999999 | 65.31 |
| 0.7381944444444444 | 60.85 |
| 0.7388888888888889 | 60.85 |
| 0.7395833333333334 | 56.398 |
| 0.7402777777777777 | 51.951 |
| 0.7409722222222223 | 47.511 |
| 0.7416666666666667 | 43.079 |
| 0.7423611111111111 | 43.079 |
| 0.7430555555555555 | 38.653 |
| 0.74375 | 38.653 |
| 0.7444444444444445 | 38.653 |
| 0.7451388888888889 | 34.234 |
| 0.7458333333333332 | 34.234 |
| 0.7465277777777778 | 29.823 |
| 0.7472222222222222 | 29.823 |
| 0.7479166666666667 | 29.823 |
| 0.748611111111111 | 29.823 |
| 0.7493055555555556 | 25.419 |
| 0.75 | 25.419 |
| 0.7506944444444444 | 21.024 |
| 0.751388888888889 | 21.024 |
| 0.7520833333333333 | 21.024 |
| 0.7527777777777778 | 21.024 |
| 0.7534722222222222 | 16.636 |
| 0.7541666666666668 | 16.636 |
| 0.7548611111111111 | 12.257 |
| 0.7555555555555555 | 12.257 |
| 0.75625 | 12.257 |
| 0.7569444444444445 | 7.887 |
| 0.7576388888888889 | 7.887 |
| 0.7583333333333333 | 3.525 |
| 0.7590277777777777 | 3.525 |
| 0.7597222222222223 | 3.525 |
| 0.7604166666666666 | 3.525 |
| 0.7611111111111111 | 3.525 |
| 0.7618055555555556 | 3.525 |
| 0.7625000000000001 | 3.525 |
| 0.7631944444444444 | 3.525 |
| 0.7638888888888888 | 3.525 |
| 0.7645833333333334 | 0 |
| 0.7652777777777778 | 0 |
| 0.7659722222222222 | 0 |
| 0.7666666666666666 | 0 |
| 0.7673611111111112 | 0 |
| 0.7680555555555556 | 0 |
| 0.7687499999999999 | 0 |
| 0.7694444444444444 | 0 |
| 0.7701388888888889 | 0 |
| 0.7708333333333334 | 0 |
| 0.7715277777777777 | 0 |
| 0.7722222222222223 | 0 |
| 0.7729166666666667 | 0 |
| 0.7736111111111111 | 0 |
| 0.7743055555555555 | 0 |
| 0.775 | 0 |
| 0.7756944444444445 | 0 |
| 0.7763888888888889 | 0 |
| 0.7770833333333332 | 0 |
| 0.7777777777777778 | 0 |
| 0.7784722222222222 | 0 |
| 0.7791666666666667 | 0 |
| 0.779861111111111 | 0 |
| 0.7805555555555556 | 0 |
| 0.78125 | 0 |
| 0.7819444444444444 | 0 |
| 0.782638888888889 | 0 |
| 0.7833333333333333 | 0 |
| 0.7840277777777778 | 0 |
| 0.7847222222222222 | 0 |
| 0.7854166666666668 | 0 |
| 0.7861111111111111 | 0 |
| 0.7868055555555555 | 0 |
| 0.7875 | 0 |
| 0.7881944444444445 | 0 |
| 0.7888888888888889 | 0 |
| 0.7895833333333333 | 0 |
| 0.7902777777777777 | 0 |
| 0.7909722222222223 | 0 |
| 0.7916666666666666 | 0 |
| 0.7923611111111111 | 0 |
| 0.7930555555555556 | 0 |
| 0.7937500000000001 | 0 |
| 0.7944444444444444 | 0 |
| 0.7951388888888888 | 0 |
| 0.7958333333333334 | 0 |
| 0.7965277777777778 | 0 |
| 0.7972222222222222 | 0 |
| 0.7979166666666666 | 0 |
| 0.7986111111111112 | 0 |
| 0.7993055555555556 | 0 |
| 0.7999999999999999 | 0 |
| 0.8006944444444444 | 0 |
| 0.8013888888888889 | 0 |
| 0.8020833333333334 | 0 |
| 0.8027777777777777 | 0 |
| 0.8034722222222223 | 0 |
| 0.8041666666666667 | 0 |
| 0.8048611111111111 | 0 |
| 0.8055555555555555 | 0 |
| 0.80625 | 0 |
| 0.8069444444444445 | 0 |
| 0.8076388888888889 | 0 |
| 0.8083333333333332 | 0 |
| 0.8090277777777778 | 0 |
| 0.8097222222222222 | 0 |
| 0.8104166666666667 | 0 |
| 0.811111111111111 | 0 |
| 0.8118055555555556 | 0 |
| 0.8125 | 0 |
| 0.8131944444444444 | 0 |
| 0.813888888888889 | 0 |
| 0.8145833333333333 | 0 |
| 0.8152777777777778 | 0 |
| 0.8159722222222222 | 0 |
| 0.8166666666666668 | 0 |
| 0.8173611111111111 | 0 |
| 0.8180555555555555 | 0 |
| 0.81875 | 0 |
| 0.8194444444444445 | 0 |
| 0.8201388888888889 | 0 |
| 0.8208333333333333 | 0 |
| 0.8215277777777777 | 0 |
| 0.8222222222222223 | 0 |
| 0.8229166666666666 | 0 |
| 0.8236111111111111 | 0 |
| 0.8243055555555556 | 0 |
| 0.8250000000000001 | 0 |
| 0.8256944444444444 | 0 |
| 0.8263888888888888 | 0 |
| 0.8270833333333334 | 0 |
| 0.8277777777777778 | 0 |
| 0.8284722222222222 | 0 |
| 0.8291666666666666 | 0 |
| 0.8298611111111112 | 0 |
| 0.8305555555555556 | 0 |
| 0.8312499999999999 | 0 |
| 0.8319444444444444 | 0 |
| 0.8326388888888889 | 0 |
| 0.8333333333333334 | 0 |
| 0.8340277777777777 | 0 |
| 0.8347222222222223 | 0 |
| 0.8354166666666667 | 0 |
| 0.8361111111111111 | 0 |
| 0.8368055555555555 | 0 |
| 0.8375 | 0 |
| 0.8381944444444445 | 0 |
| 0.8388888888888889 | 0 |
| 0.8395833333333332 | 0 |
| 0.8402777777777778 | 0 |
| 0.8409722222222222 | 0 |
| 0.8416666666666667 | 0 |
| 0.842361111111111 | 0 |
| 0.8430555555555556 | 0 |
| 0.84375 | 0 |
| 0.8444444444444444 | 0 |
| 0.845138888888889 | 0 |
| 0.8458333333333333 | 0 |
| 0.8465277777777778 | 0 |
| 0.8472222222222222 | 0 |
| 0.8479166666666668 | 0 |
| 0.8486111111111111 | 0 |
| 0.8493055555555555 | 0 |
| 0.85 | 0 |
| 0.8506944444444445 | 0 |
| 0.8513888888888889 | 0 |
| 0.8520833333333333 | 0 |
| 0.8527777777777777 | 0 |
| 0.8534722222222223 | 0 |
| 0.8541666666666666 | 0 |
| 0.8548611111111111 | 0 |
| 0.8555555555555556 | 0 |
| 0.8562500000000001 | 0 |
| 0.8569444444444444 | 0 |
| 0.8576388888888888 | 0 |
| 0.8583333333333334 | 0 |
| 0.8590277777777778 | 0 |
| 0.8597222222222222 | 0 |
| 0.8604166666666666 | 0 |
| 0.8611111111111112 | 0 |
| 0.8618055555555556 | 0 |
| 0.8624999999999999 | 0 |
| 0.8631944444444444 | 0 |
| 0.8638888888888889 | 0 |
| 0.8645833333333334 | 0 |
| 0.8652777777777777 | 0 |
| 0.8659722222222223 | 0 |
| 0.8666666666666667 | 0 |
| 0.8673611111111111 | 0 |
| 0.8680555555555555 | 0 |
| 0.86875 | 0 |
| 0.8694444444444445 | 0 |
| 0.8701388888888889 | 0 |
| 0.8708333333333332 | 0 |
| 0.8715277777777778 | 0 |
| 0.8722222222222222 | 0 |
| 0.8729166666666667 | 0 |
| 0.873611111111111 | 0 |
| 0.8743055555555556 | 0 |
| 0.875 | 0 |
| 0.8756944444444444 | 0 |
| 0.876388888888889 | 0 |
| 0.8770833333333333 | 0 |
| 0.8777777777777778 | 0 |
| 0.8784722222222222 | 0 |
| 0.8791666666666668 | 0 |
| 0.8798611111111111 | 0 |
| 0.8805555555555555 | 0 |
| 0.88125 | 0 |
| 0.8819444444444445 | 0 |
| 0.8826388888888889 | 0 |
| 0.8833333333333333 | 0 |
| 0.8840277777777777 | 0 |
| 0.8847222222222223 | 0 |
| 0.8854166666666666 | 0 |
| 0.8861111111111111 | 0 |
| 0.8868055555555556 | 0 |
| 0.8875000000000001 | 0 |
| 0.8881944444444444 | 0 |
| 0.8888888888888888 | 0 |
| 0.8895833333333334 | 0 |
| 0.8902777777777778 | 0 |
| 0.8909722222222222 | 0 |
| 0.8916666666666666 | 0 |
| 0.8923611111111112 | 0 |
| 0.8930555555555556 | 0 |
| 0.8937499999999999 | 0 |
| 0.8944444444444444 | 0 |
| 0.8951388888888889 | 0 |
| 0.8958333333333334 | 0 |
| 0.8965277777777777 | 0 |
| 0.8972222222222223 | 0 |
| 0.8979166666666667 | 0 |
| 0.8986111111111111 | 0 |
| 0.8993055555555555 | 0 |
| 0.9 | 0 |
| 0.9006944444444445 | 0 |
| 0.9013888888888889 | 0 |
| 0.9020833333333332 | 0 |
| 0.9027777777777778 | 0 |
| 0.9034722222222222 | 0 |
| 0.9041666666666667 | 0 |
| 0.904861111111111 | 0 |
| 0.9055555555555556 | 0 |
| 0.90625 | 0 |
| 0.9069444444444444 | 0 |
| 0.907638888888889 | 0 |
| 0.9083333333333333 | 0 |
| 0.9090277777777778 | 0 |
| 0.9097222222222222 | 0 |
| 0.9104166666666668 | 0 |
| 0.9111111111111111 | 0 |
| 0.9118055555555555 | 0 |
| 0.9125 | 0 |
| 0.9131944444444445 | 0 |
| 0.9138888888888889 | 0 |
| 0.9145833333333333 | 0 |
| 0.9152777777777777 | 0 |
| 0.9159722222222223 | 0 |
| 0.9166666666666666 | 0 |
| 0.9173611111111111 | 0 |
| 0.9180555555555556 | 0 |
| 0.9187500000000001 | 0 |
| 0.9194444444444444 | 0 |
| 0.9201388888888888 | 0 |
| 0.9208333333333334 | 0 |
| 0.9215277777777778 | 0 |
| 0.9222222222222222 | 0 |
| 0.9229166666666666 | 0 |
| 0.9236111111111112 | 0 |
| 0.9243055555555556 | 0 |
| 0.9249999999999999 | 0 |
| 0.9256944444444444 | 0 |
| 0.9263888888888889 | 0 |
| 0.9270833333333334 | 0 |
| 0.9277777777777777 | 0 |
| 0.9284722222222223 | 0 |
| 0.9291666666666667 | 0 |
| 0.9298611111111111 | 0 |
| 0.9305555555555555 | 0 |
| 0.93125 | 0 |
| 0.9319444444444445 | 0 |
| 0.9326388888888889 | 0 |
| 0.9333333333333332 | 0 |
| 0.9340277777777778 | 0 |
| 0.9347222222222222 | 0 |
| 0.9354166666666667 | 0 |
| 0.936111111111111 | 0 |
| 0.9368055555555556 | 0 |
| 0.9375 | 0 |
| 0.9381944444444444 | 0 |
| 0.938888888888889 | 0 |
| 0.9395833333333333 | 0 |
| 0.9402777777777778 | 0 |
| 0.9409722222222222 | 0 |
| 0.9416666666666668 | 0 |
| 0.9423611111111111 | 0 |
| 0.9430555555555555 | 0 |
| 0.94375 | 0 |
| 0.9444444444444445 | 0 |
| 0.9451388888888889 | 0 |
| 0.9458333333333333 | 0 |
| 0.9465277777777777 | 0 |
| 0.9472222222222223 | 0 |
| 0.9479166666666666 | 0 |
| 0.9486111111111111 | 0 |
| 0.9493055555555556 | 0 |
| 0.9500000000000001 | 0 |
| 0.9506944444444444 | 0 |
| 0.9513888888888888 | 0 |
| 0.9520833333333334 | 0 |
| 0.9527777777777778 | 0 |
| 0.9534722222222222 | 0 |
| 0.9541666666666666 | 0 |
| 0.9548611111111112 | 0 |
| 0.9555555555555556 | 0 |
| 0.9562499999999999 | 0 |
| 0.9569444444444444 | 0 |
| 0.9576388888888889 | 0 |
| 0.9583333333333334 | 0 |
| 0.9590277777777777 | 0 |
| 0.9597222222222223 | 0 |
| 0.9604166666666667 | 0 |
| 0.9611111111111111 | 0 |
| 0.9618055555555555 | 0 |
| 0.9625 | 0 |
| 0.9631944444444445 | 0 |
| 0.9638888888888889 | 0 |
| 0.9645833333333332 | 0 |
| 0.9652777777777778 | 0 |
| 0.9659722222222222 | 0 |
| 0.9666666666666667 | 0 |
| 0.967361111111111 | 0 |
| 0.9680555555555556 | 0 |
| 0.96875 | 0 |
| 0.9694444444444444 | 0 |
| 0.970138888888889 | 0 |
| 0.9708333333333333 | 0 |
| 0.9715277777777778 | 0 |
| 0.9722222222222222 | 0 |
| 0.9729166666666668 | 0 |
| 0.9736111111111111 | 0 |
| 0.9743055555555555 | 0 |
| 0.975 | 0 |
| 0.9756944444444445 | 0 |
| 0.9763888888888889 | 0 |
| 0.9770833333333333 | 0 |
| 0.9777777777777777 | 0 |
| 0.9784722222222223 | 0 |
| 0.9791666666666666 | 0 |
| 0.9798611111111111 | 0 |
| 0.9805555555555556 | 0 |
| 0.9812500000000001 | 0 |
| 0.9819444444444444 | 0 |
| 0.9826388888888888 | 0 |
| 0.9833333333333334 | 0 |
| 0.9840277777777778 | 0 |
| 0.9847222222222222 | 0 |
| 0.9854166666666666 | 0 |
| 0.9861111111111112 | 0 |
| 0.9868055555555556 | 0 |
| 0.9874999999999999 | 0 |
| 0.9881944444444444 | 0 |
| 0.9888888888888889 | 0 |
| 0.9895833333333334 | 0 |
| 0.9902777777777777 | 0 |
| 0.9909722222222223 | 0 |
| 0.9916666666666667 | 0 |
| 0.9923611111111111 | 0 |
| 0.9930555555555555 | 0 |
| 0.99375 | 0 |
| 0.9944444444444445 | 0 |
| 0.9951388888888889 | 0 |
| 0.9958333333333332 | 0 |
| 0.9965277777777778 | 0 |
| 0.9972222222222222 | 0 |
| 0.9979166666666667 | 0 |
| 0.998611111111111 | 0 |
| 0.9993055555555556 | 0 |